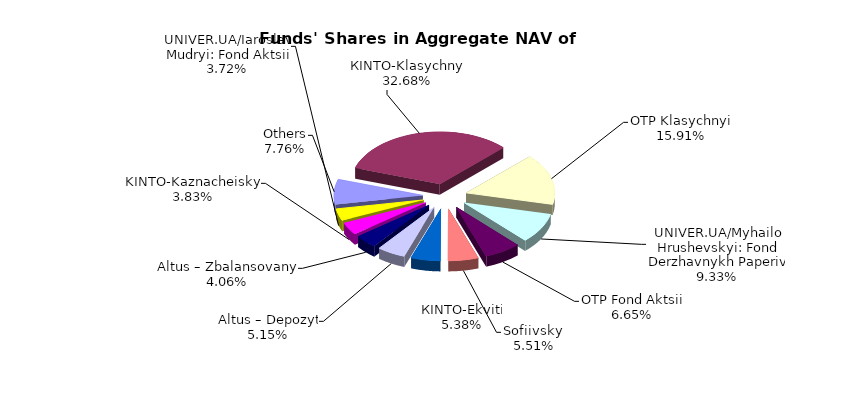
| Category | Series 0 | Series 1 |
|---|---|---|
| Others | 6890697.54 | 0.078 |
| КІNТО-Klasychnyi | 29006728.49 | 0.327 |
| OTP Klasychnyi' | 14122146.47 | 0.159 |
| UNIVER.UA/Myhailo Hrushevskyi: Fond Derzhavnykh Paperiv | 8285702.73 | 0.093 |
| OTP Fond Aktsii | 5904184.49 | 0.067 |
| Sofiivskyi | 4891152.05 | 0.055 |
| КІNTO-Ekviti | 4778259 | 0.054 |
| Altus – Depozyt | 4574591.66 | 0.052 |
| Altus – Zbalansovanyi | 3607562.59 | 0.041 |
| KINTO-Kaznacheiskyi | 3401557.58 | 0.038 |
| UNIVER.UA/Iaroslav Mudryi: Fond Aktsii | 3302905.22 | 0.037 |